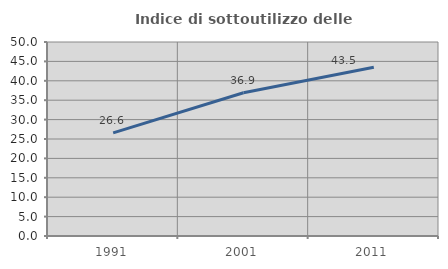
| Category | Indice di sottoutilizzo delle abitazioni  |
|---|---|
| 1991.0 | 26.59 |
| 2001.0 | 36.914 |
| 2011.0 | 43.478 |